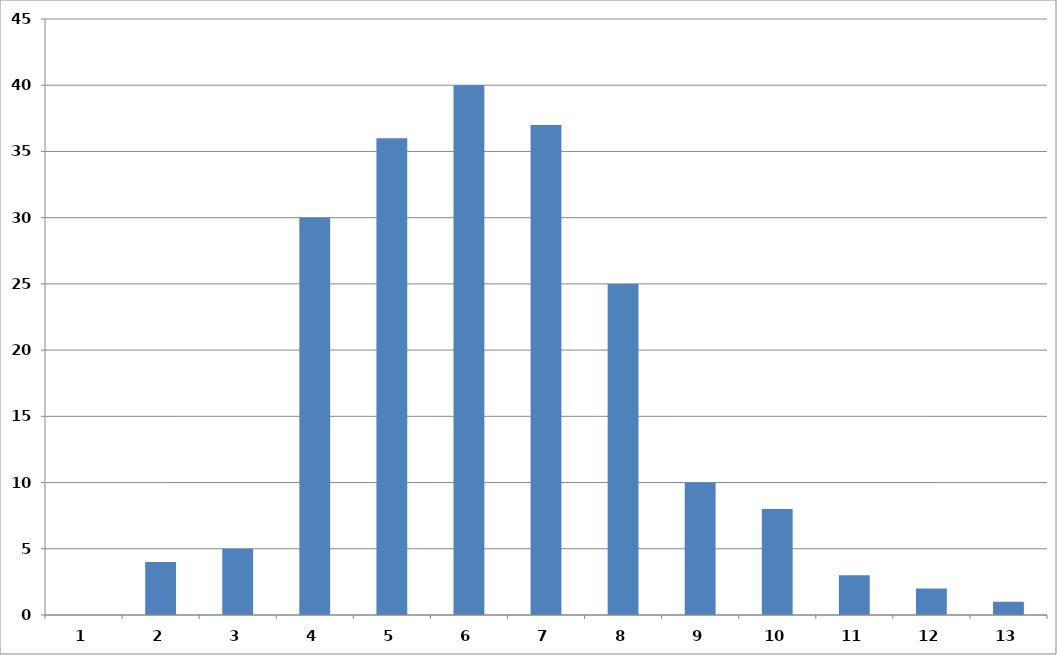
| Category | Series 0 |
|---|---|
| 0 | 0 |
| 1 | 4 |
| 2 | 5 |
| 3 | 30 |
| 4 | 36 |
| 5 | 40 |
| 6 | 37 |
| 7 | 25 |
| 8 | 10 |
| 9 | 8 |
| 10 | 3 |
| 11 | 2 |
| 12 | 1 |